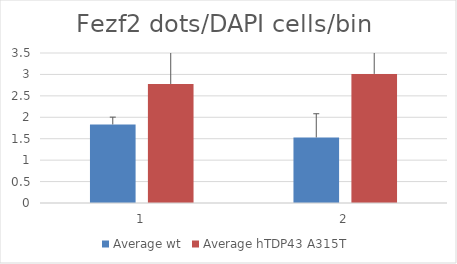
| Category | Average wt | Average hTDP43 A315T  |
|---|---|---|
| 0 | 1.833 | 2.777 |
| 1 | 1.53 | 3.013 |